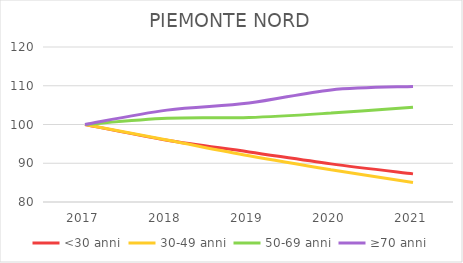
| Category | <30 anni | 30-49 anni | 50-69 anni | ≥70 anni |
|---|---|---|---|---|
| 2017.0 | 100 | 100 | 100 | 100 |
| 2018.0 | 95.934 | 95.993 | 101.584 | 103.71 |
| 2019.0 | 92.931 | 91.925 | 101.8 | 105.543 |
| 2020.0 | 89.836 | 88.33 | 102.952 | 108.923 |
| 2021.0 | 87.257 | 85.019 | 104.481 | 109.825 |